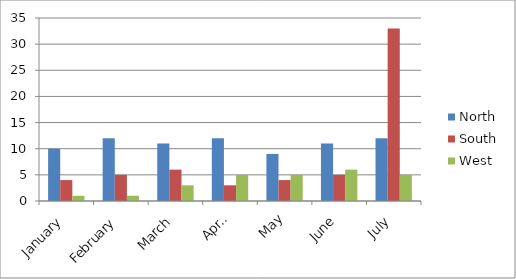
| Category | North | South | West |
|---|---|---|---|
| January | 10 | 4 | 1 |
| February | 12 | 5 | 1 |
| March | 11 | 6 | 3 |
| April | 12 | 3 | 5 |
| May | 9 | 4 | 5 |
| June | 11 | 5 | 6 |
| July | 12 | 33 | 5 |